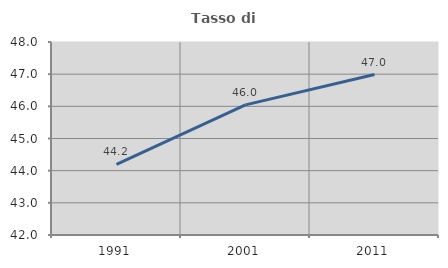
| Category | Tasso di occupazione   |
|---|---|
| 1991.0 | 44.194 |
| 2001.0 | 46.045 |
| 2011.0 | 46.987 |